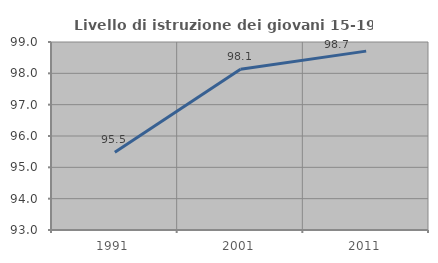
| Category | Livello di istruzione dei giovani 15-19 anni |
|---|---|
| 1991.0 | 95.478 |
| 2001.0 | 98.13 |
| 2011.0 | 98.709 |